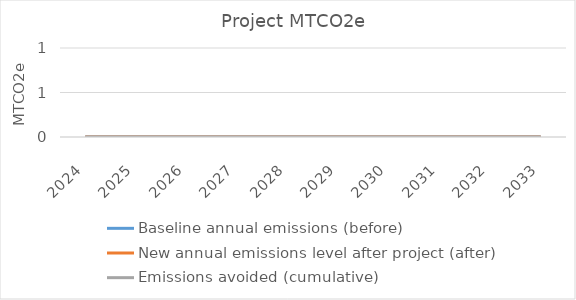
| Category | Baseline annual emissions (before) | New annual emissions level after project (after) | Emissions avoided (cumulative) |
|---|---|---|---|
| 2024.0 | 0 | 0 | 0 |
| 2025.0 | 0 | 0 | 0 |
| 2026.0 | 0 | 0 | 0 |
| 2027.0 | 0 | 0 | 0 |
| 2028.0 | 0 | 0 | 0 |
| 2029.0 | 0 | 0 | 0 |
| 2030.0 | 0 | 0 | 0 |
| 2031.0 | 0 | 0 | 0 |
| 2032.0 | 0 | 0 | 0 |
| 2033.0 | 0 | 0 | 0 |